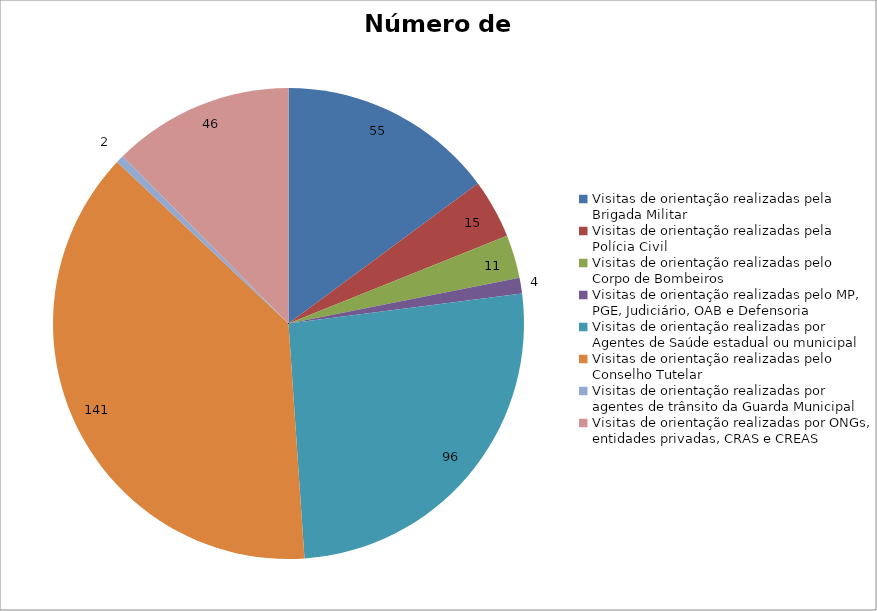
| Category | Número de Ações |
|---|---|
| Visitas de orientação realizadas pela Brigada Militar | 55 |
| Visitas de orientação realizadas pela Polícia Civil | 15 |
| Visitas de orientação realizadas pelo Corpo de Bombeiros | 11 |
| Visitas de orientação realizadas pelo MP, PGE, Judiciário, OAB e Defensoria | 4 |
| Visitas de orientação realizadas por Agentes de Saúde estadual ou municipal | 96 |
| Visitas de orientação realizadas pelo Conselho Tutelar | 141 |
| Visitas de orientação realizadas por agentes de trânsito da Guarda Municipal | 2 |
| Visitas de orientação realizadas por ONGs, entidades privadas, CRAS e CREAS | 46 |